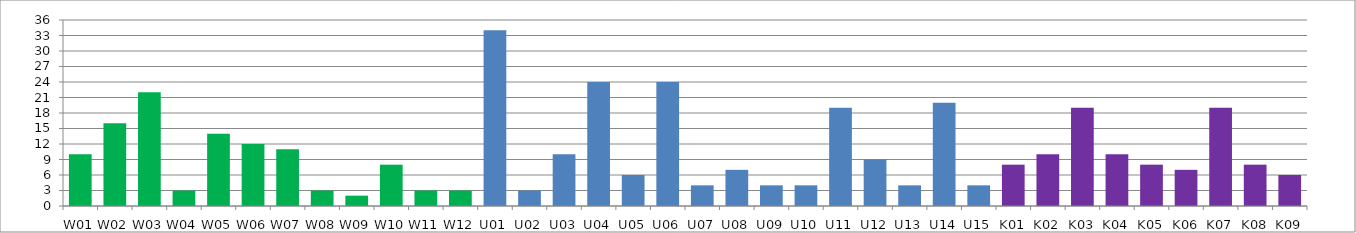
| Category | Series 0 |
|---|---|
| W01 | 10 |
| W02 | 16 |
| W03 | 22 |
| W04 | 3 |
| W05 | 14 |
| W06 | 12 |
| W07 | 11 |
| W08 | 3 |
| W09 | 2 |
| W10 | 8 |
| W11 | 3 |
| W12 | 3 |
| U01 | 34 |
| U02 | 3 |
| U03 | 10 |
| U04 | 24 |
| U05 | 6 |
| U06 | 24 |
| U07 | 4 |
| U08 | 7 |
| U09 | 4 |
| U10 | 4 |
| U11 | 19 |
| U12 | 9 |
| U13 | 4 |
| U14 | 20 |
| U15 | 4 |
| K01 | 8 |
| K02 | 10 |
| K03 | 19 |
| K04 | 10 |
| K05 | 8 |
| K06 | 7 |
| K07 | 19 |
| K08 | 8 |
| K09 | 6 |